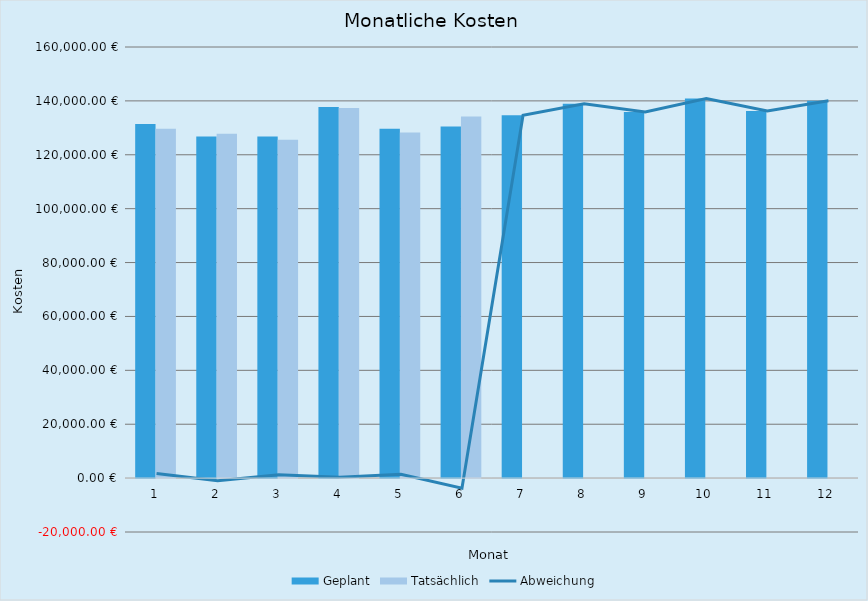
| Category | Geplant | Tatsächlich |
|---|---|---|
| 0 | 131420 | 129682 |
| 1 | 126820 | 127804 |
| 2 | 126820 | 125565 |
| 3 | 137695 | 137394 |
| 4 | 129695 | 128255 |
| 5 | 130495 | 134239 |
| 6 | 134695 | 0 |
| 7 | 138918 | 0 |
| 8 | 135918 | 0 |
| 9 | 140918 | 0 |
| 10 | 136218 | 0 |
| 11 | 140018 | 0 |